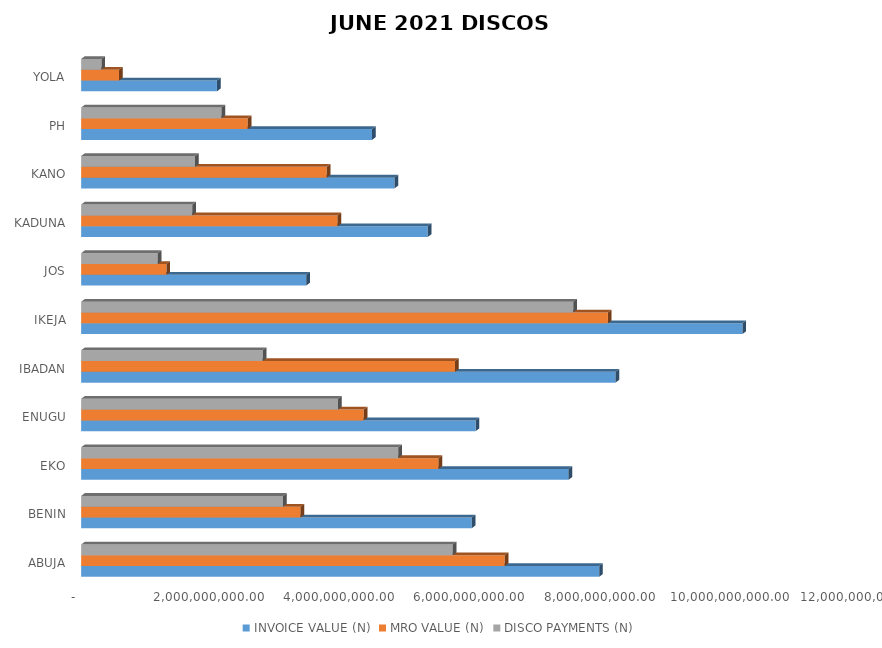
| Category | INVOICE VALUE (N) | MRO VALUE (N) | DISCO PAYMENTS (N) |
|---|---|---|---|
| ABUJA | 7961056026.764 | 6509755513.085 | 5712853804.81 |
| BENIN | 6002524318.498 | 3372818414.564 | 3103905325.1 |
| EKO | 7491888342.383 | 5493801721.47 | 4874222555.55 |
| ENUGU | 6062633622.137 | 4342664463.537 | 3949199541.45 |
| IBADAN | 8212163199.71 | 5745229374.517 | 2790582222.79 |
| IKEJA | 10162972758.856 | 8095824099.705 | 7562268029.86 |
| JOS | 3459561614.479 | 1310481939.565 | 1179018598.22 |
| KADUNA | 5325866052.807 | 3941140879.078 | 1707145676.01 |
| KANO | 4814826742.027 | 3773861200.4 | 1750079084.47 |
| PH | 4470859271.321 | 2560461104.686 | 2158083770.27 |
| YOLA | 2086899977.369 | 582871163.679 | 311424224.15 |